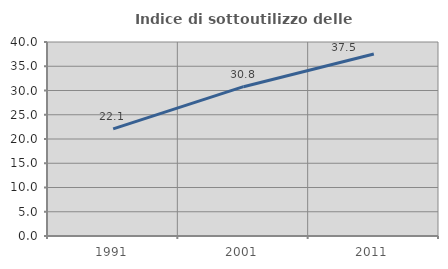
| Category | Indice di sottoutilizzo delle abitazioni  |
|---|---|
| 1991.0 | 22.1 |
| 2001.0 | 30.789 |
| 2011.0 | 37.519 |